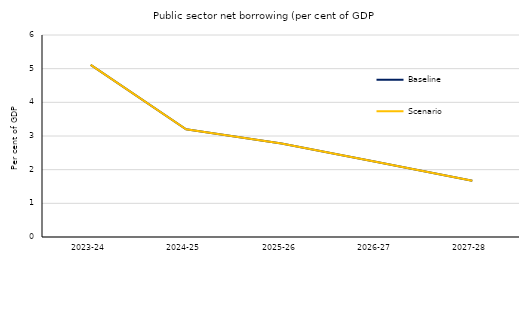
| Category | Baseline | Scenario |
|---|---|---|
| 2023-24 | 5.113 | 5.113 |
| 2024-25 | 3.2 | 3.2 |
| 2025-26 | 2.779 | 2.779 |
| 2026-27 | 2.227 | 2.227 |
| 2027-28 | 1.67 | 1.67 |